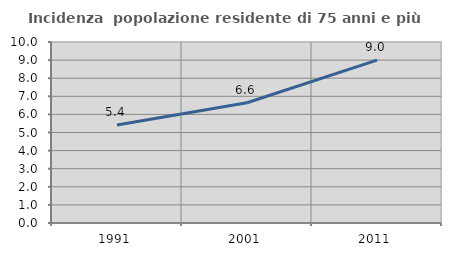
| Category | Incidenza  popolazione residente di 75 anni e più |
|---|---|
| 1991.0 | 5.411 |
| 2001.0 | 6.644 |
| 2011.0 | 8.995 |